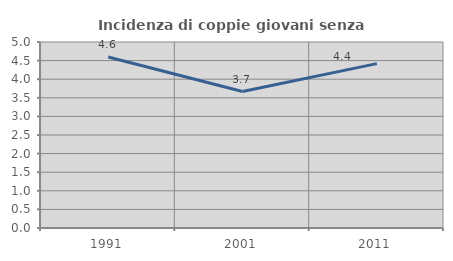
| Category | Incidenza di coppie giovani senza figli |
|---|---|
| 1991.0 | 4.598 |
| 2001.0 | 3.667 |
| 2011.0 | 4.419 |